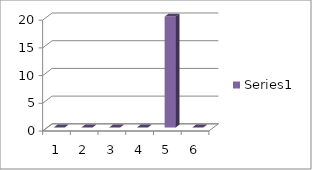
| Category | Series 0 |
|---|---|
| 0 | 0 |
| 1 | 0 |
| 2 | 0 |
| 3 | 0 |
| 4 | 20 |
| 5 | 0 |